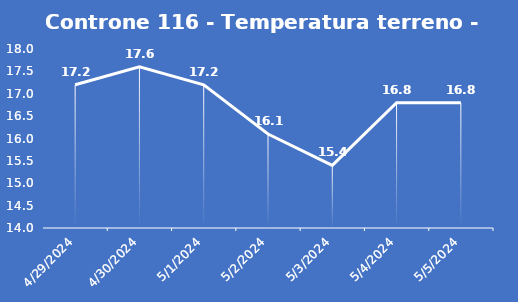
| Category | Controne 116 - Temperatura terreno - Grezzo (°C) |
|---|---|
| 4/29/24 | 17.2 |
| 4/30/24 | 17.6 |
| 5/1/24 | 17.2 |
| 5/2/24 | 16.1 |
| 5/3/24 | 15.4 |
| 5/4/24 | 16.8 |
| 5/5/24 | 16.8 |